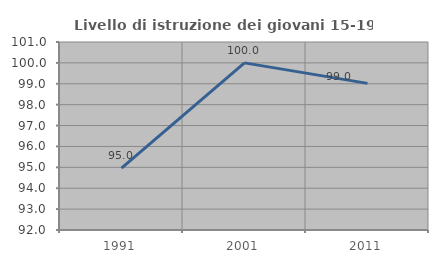
| Category | Livello di istruzione dei giovani 15-19 anni |
|---|---|
| 1991.0 | 94.958 |
| 2001.0 | 100 |
| 2011.0 | 99.02 |